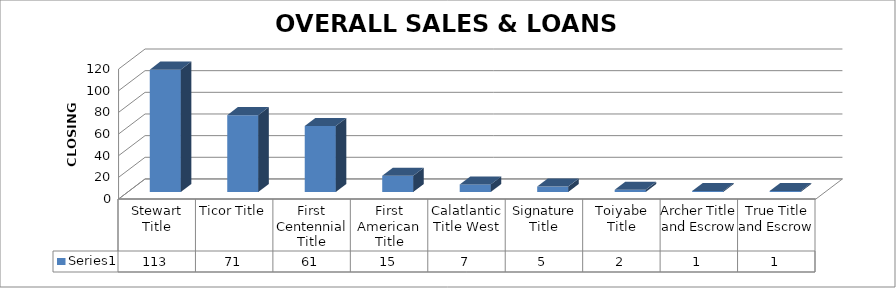
| Category | Series 0 |
|---|---|
| Stewart Title | 113 |
| Ticor Title | 71 |
| First Centennial Title | 61 |
| First American Title | 15 |
| Calatlantic Title West | 7 |
| Signature Title | 5 |
| Toiyabe Title | 2 |
| Archer Title and Escrow | 1 |
| True Title and Escrow | 1 |